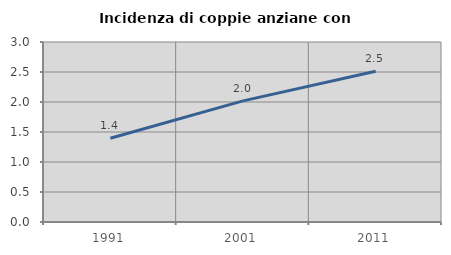
| Category | Incidenza di coppie anziane con figli |
|---|---|
| 1991.0 | 1.396 |
| 2001.0 | 2.018 |
| 2011.0 | 2.513 |